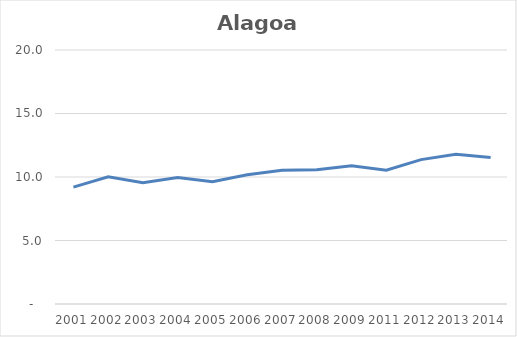
| Category | Total |
|---|---|
| 2001.0 | 9.207 |
| 2002.0 | 10.019 |
| 2003.0 | 9.546 |
| 2004.0 | 9.955 |
| 2005.0 | 9.636 |
| 2006.0 | 10.181 |
| 2007.0 | 10.532 |
| 2008.0 | 10.562 |
| 2009.0 | 10.876 |
| 2011.0 | 10.531 |
| 2012.0 | 11.369 |
| 2013.0 | 11.793 |
| 2014.0 | 11.533 |